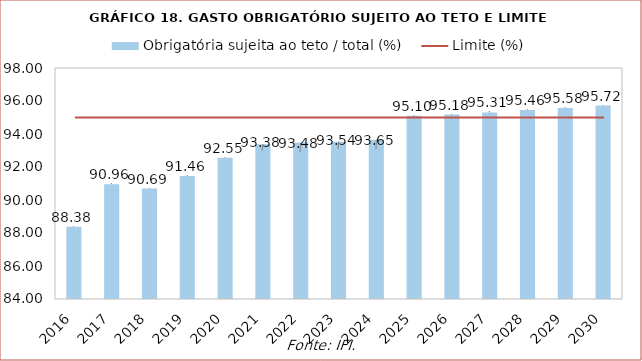
| Category | Obrigatória sujeita ao teto / total (%) |
|---|---|
| 2016.0 | 88.375 |
| 2017.0 | 90.962 |
| 2018.0 | 90.695 |
| 2019.0 | 91.456 |
| 2020.0 | 92.554 |
| 2021.0 | 93.379 |
| 2022.0 | 93.479 |
| 2023.0 | 93.538 |
| 2024.0 | 93.646 |
| 2025.0 | 95.1 |
| 2026.0 | 95.181 |
| 2027.0 | 95.306 |
| 2028.0 | 95.459 |
| 2029.0 | 95.577 |
| 2030.0 | 95.722 |